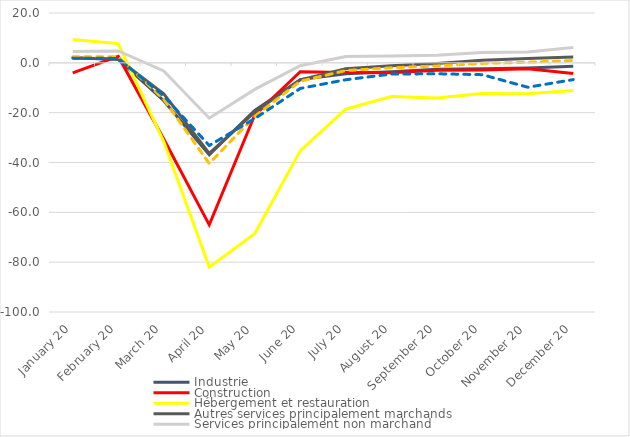
| Category | Industrie | Construction | Hébergement et restauration | Autres services principalement marchands | Services principalement non marchand | Ensemble – La Réunion | Ensemble – France (hors Mayotte) |
|---|---|---|---|---|---|---|---|
| 2020-01-31 | 1.964 | -4.003 | 9.406 | 2.005 | 4.519 | 2.392 | 1.889 |
| 2020-02-28 | 1.412 | 2.576 | 7.717 | 1.432 | 4.777 | 2.441 | 1.772 |
| 2020-03-28 | -15.192 | -30.598 | -31.612 | -12.437 | -3.242 | -14.648 | -13.312 |
| 2020-04-28 | -36.864 | -65.016 | -81.988 | -36.346 | -22.215 | -40.372 | -33.189 |
| 2020-05-28 | -19.105 | -20.955 | -68.559 | -19.762 | -10.672 | -21.459 | -22.397 |
| 2020-06-28 | -6.718 | -3.576 | -35.32 | -6.844 | -1.15 | -7.39 | -10.272 |
| 2020-07-28 | -4.429 | -3.923 | -18.611 | -2.413 | 2.558 | -3.105 | -6.786 |
| 2020-08-28 | -3.554 | -3.998 | -13.512 | -1.19 | 2.774 | -2.003 | -4.501 |
| 2020-09-28 | -2.573 | -3.006 | -14.148 | -0.245 | 3.025 | -1.255 | -4.385 |
| 2020-10-28 | -2.39 | -2.884 | -12.298 | 1.083 | 4.156 | -0.225 | -4.751 |
| 2020-11-28 | -2.099 | -2.372 | -12.379 | 1.727 | 4.339 | 0.25 | -9.794 |
| 2020-12-28 | -1.417 | -4.326 | -11.065 | 2.373 | 6.113 | 0.943 | -6.733 |